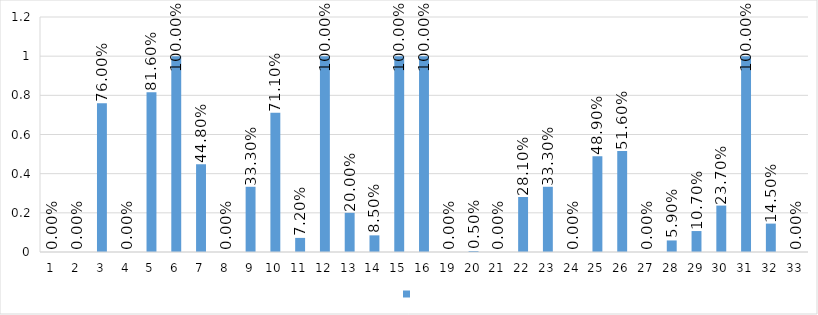
| Category | Series 0 |
|---|---|
| 1 | 0 |
| 2 | 0 |
| 3 | 0.76 |
| 4 | 0 |
| 5 | 0.816 |
| 6 | 1 |
| 7 | 0.448 |
| 8 | 0 |
| 9 | 0.333 |
| 10 | 0.711 |
| 11 | 0.072 |
| 12 | 1 |
| 13 | 0.2 |
| 14 | 0.085 |
| 15 | 1 |
| 16 | 1 |
| 19 | 0 |
| 20 | 0.005 |
| 21 | 0 |
| 22 | 0.281 |
| 23 | 0.333 |
| 24 | 0 |
| 25 | 0.489 |
| 26 | 0.516 |
| 27 | 0 |
| 28 | 0.059 |
| 29 | 0.107 |
| 30 | 0.237 |
| 31 | 1 |
| 32 | 0.145 |
| 33 | 0 |